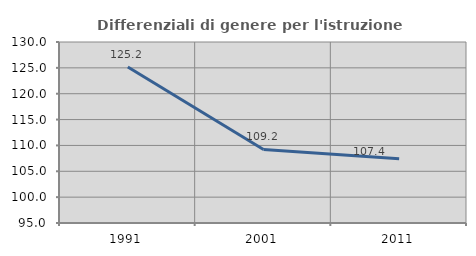
| Category | Differenziali di genere per l'istruzione superiore |
|---|---|
| 1991.0 | 125.152 |
| 2001.0 | 109.227 |
| 2011.0 | 107.406 |